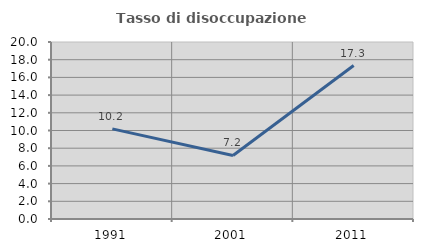
| Category | Tasso di disoccupazione giovanile  |
|---|---|
| 1991.0 | 10.18 |
| 2001.0 | 7.178 |
| 2011.0 | 17.342 |